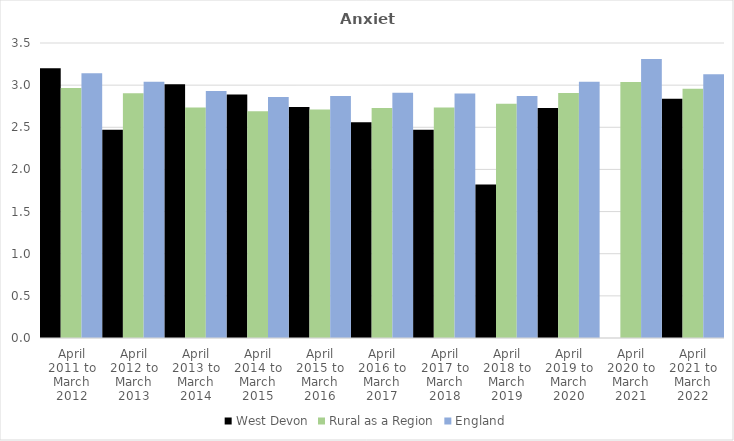
| Category | West Devon | Rural as a Region | England |
|---|---|---|---|
| April 2011 to March 2012 | 3.2 | 2.967 | 3.14 |
| April 2012 to March 2013 | 2.47 | 2.904 | 3.04 |
| April 2013 to March 2014 | 3.01 | 2.734 | 2.93 |
| April 2014 to March 2015 | 2.89 | 2.691 | 2.86 |
| April 2015 to March 2016 | 2.74 | 2.711 | 2.87 |
| April 2016 to March 2017 | 2.56 | 2.729 | 2.91 |
| April 2017 to March 2018 | 2.47 | 2.736 | 2.9 |
| April 2018 to March 2019 | 1.82 | 2.78 | 2.87 |
| April 2019 to March 2020 | 2.73 | 2.908 | 3.04 |
| April 2020 to March 2021 | 0 | 3.036 | 3.31 |
| April 2021 to March 2022 | 2.84 | 2.956 | 3.13 |